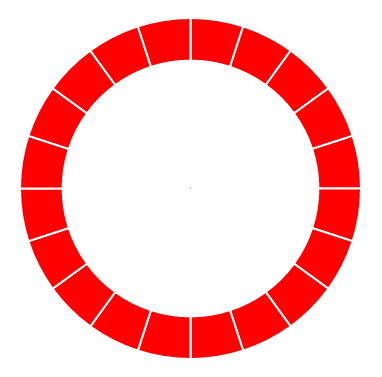
| Category | Series 1 |
|---|---|
| 0 | 1 |
| 1 | 0 |